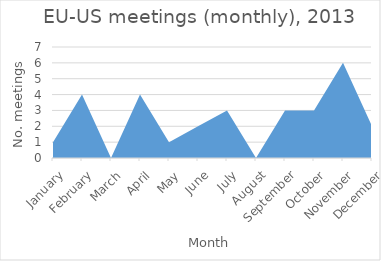
| Category | Number of meetings |
|---|---|
| January | 1 |
| February | 4 |
| March | 0 |
| April | 4 |
| May | 1 |
| June | 2 |
| July | 3 |
| August | 0 |
| September | 3 |
| October | 3 |
| November | 6 |
| December | 2 |